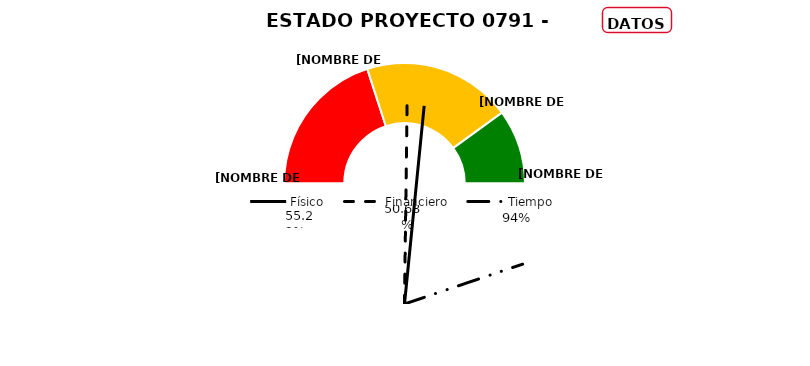
| Category | Series 0 |
|---|---|
| 0.0 | 0.4 |
| 0.4 | 0.4 |
| 0.8 | 0.2 |
| 1.0 | 1 |